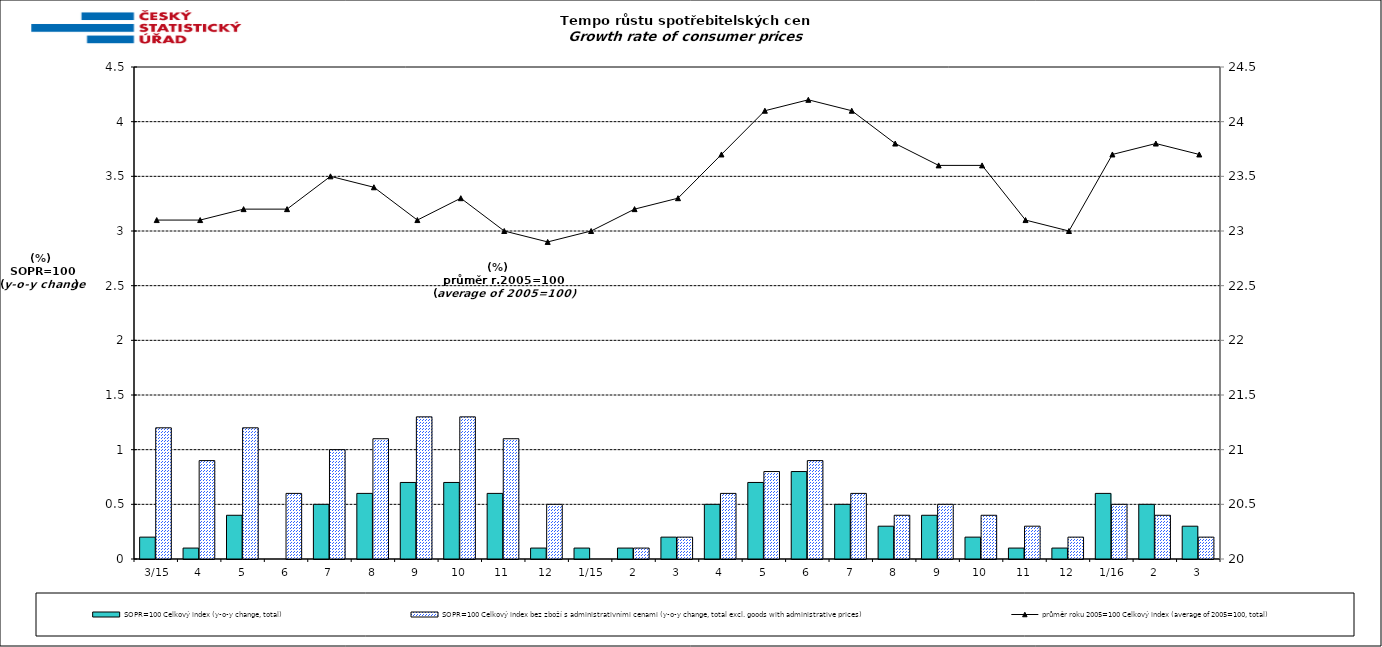
| Category | SOPR=100 Celkový index (y-o-y change, total) | SOPR=100 Celkový index bez zboží s administrativními cenami (y-o-y change, total excl. goods with administrative prices)  |
|---|---|---|
|  3/15 | 0.2 | 1.2 |
| 4 | 0.1 | 0.9 |
| 5 | 0.4 | 1.2 |
| 6 | 0 | 0.6 |
| 7 | 0.5 | 1 |
| 8 | 0.6 | 1.1 |
| 9 | 0.7 | 1.3 |
| 10 | 0.7 | 1.3 |
| 11 | 0.6 | 1.1 |
| 12 | 0.1 | 0.5 |
|  1/15 | 0.1 | 0 |
| 2 | 0.1 | 0.1 |
| 3 | 0.2 | 0.2 |
| 4 | 0.5 | 0.6 |
| 5 | 0.7 | 0.8 |
| 6 | 0.8 | 0.9 |
| 7 | 0.5 | 0.6 |
| 8 | 0.3 | 0.4 |
| 9 | 0.4 | 0.5 |
| 10 | 0.2 | 0.4 |
| 11 | 0.1 | 0.3 |
| 12 | 0.1 | 0.2 |
|  1/16 | 0.6 | 0.5 |
| 2 | 0.5 | 0.4 |
| 3 | 0.3 | 0.2 |